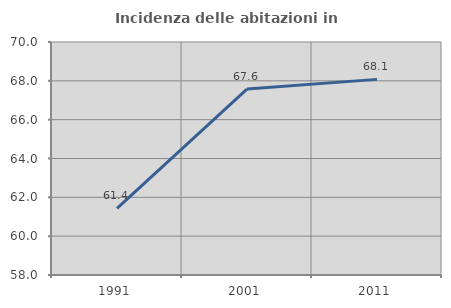
| Category | Incidenza delle abitazioni in proprietà  |
|---|---|
| 1991.0 | 61.431 |
| 2001.0 | 67.574 |
| 2011.0 | 68.075 |